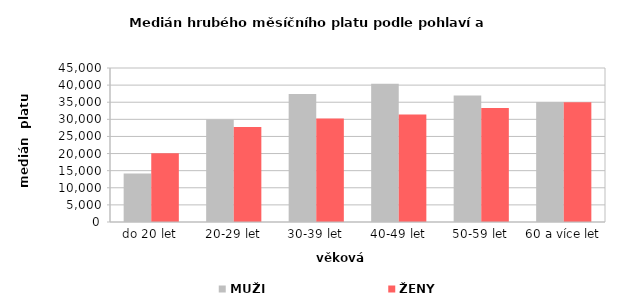
| Category | MUŽI | ŽENY |
|---|---|---|
| 0 | 14192.513 | 20091.076 |
| 1 | 29966.548 | 27745.337 |
| 2 | 37367.823 | 30271.12 |
| 3 | 40361.764 | 31448.552 |
| 4 | 36988.819 | 33292.918 |
| 5 | 35100.808 | 34967.277 |